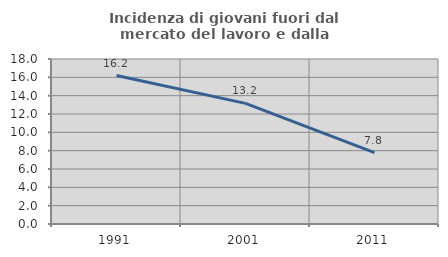
| Category | Incidenza di giovani fuori dal mercato del lavoro e dalla formazione  |
|---|---|
| 1991.0 | 16.19 |
| 2001.0 | 13.158 |
| 2011.0 | 7.792 |